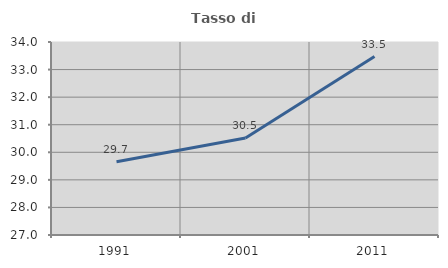
| Category | Tasso di occupazione   |
|---|---|
| 1991.0 | 29.656 |
| 2001.0 | 30.52 |
| 2011.0 | 33.473 |